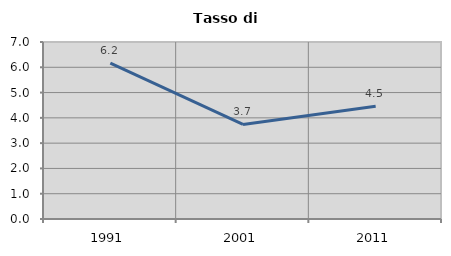
| Category | Tasso di disoccupazione   |
|---|---|
| 1991.0 | 6.161 |
| 2001.0 | 3.741 |
| 2011.0 | 4.455 |